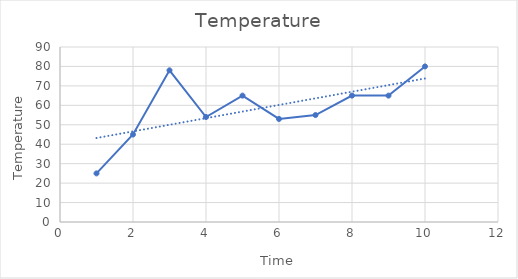
| Category | Series 0 |
|---|---|
| 1.0 | 25 |
| 2.0 | 45 |
| 3.0 | 78 |
| 4.0 | 54 |
| 5.0 | 65 |
| 6.0 | 53 |
| 7.0 | 55 |
| 8.0 | 65 |
| 9.0 | 65 |
| 10.0 | 80 |